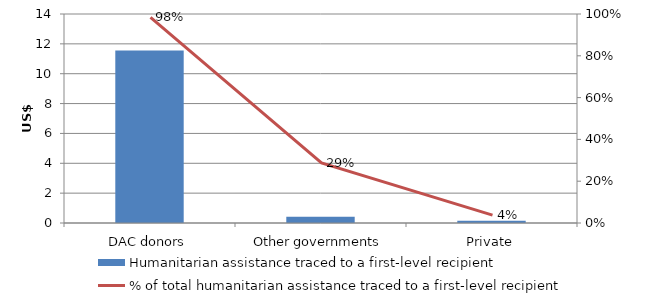
| Category | Humanitarian assistance traced to a first-level recipient |
|---|---|
| DAC donors | 11.563 |
| Other governments | 0.418 |
| Private | 0.157 |